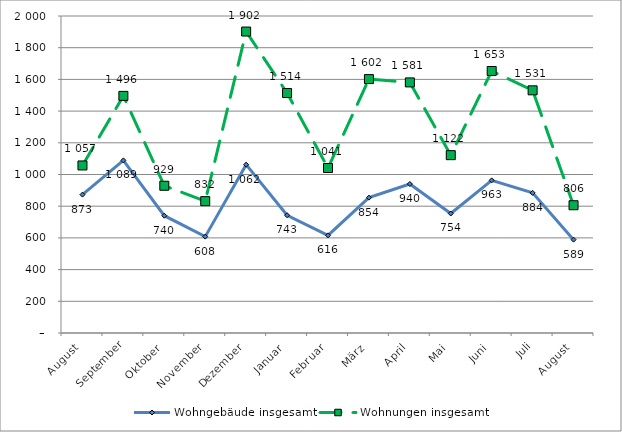
| Category | Wohngebäude insgesamt | Wohnungen insgesamt |
|---|---|---|
| August | 873 | 1057 |
| September | 1089 | 1496 |
| Oktober | 740 | 929 |
| November | 608 | 832 |
| Dezember | 1062 | 1902 |
| Januar | 743 | 1514 |
| Februar | 616 | 1041 |
| März | 854 | 1602 |
| April | 940 | 1581 |
| Mai | 754 | 1122 |
| Juni | 963 | 1653 |
| Juli | 884 | 1531 |
| August | 589 | 806 |